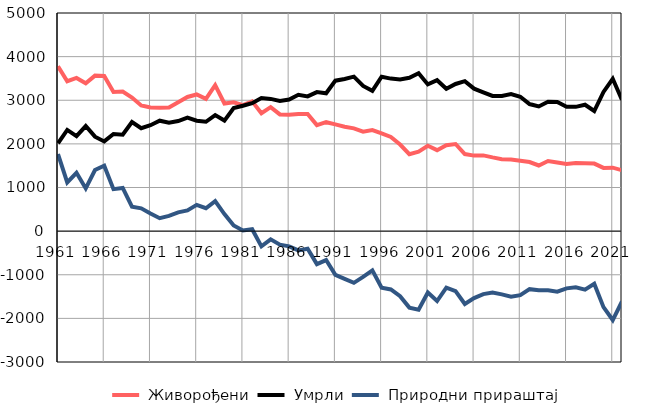
| Category |  Живорођени |  Умрли |  Природни прираштај |
|---|---|---|---|
| 1961.0 | 3780 | 2013 | 1767 |
| 1962.0 | 3436 | 2319 | 1117 |
| 1963.0 | 3512 | 2176 | 1336 |
| 1964.0 | 3388 | 2409 | 979 |
| 1965.0 | 3565 | 2165 | 1400 |
| 1966.0 | 3555 | 2056 | 1499 |
| 1967.0 | 3188 | 2226 | 962 |
| 1968.0 | 3201 | 2211 | 990 |
| 1969.0 | 3062 | 2500 | 562 |
| 1970.0 | 2880 | 2358 | 522 |
| 1971.0 | 2833 | 2428 | 405 |
| 1972.0 | 2828 | 2531 | 297 |
| 1973.0 | 2833 | 2484 | 349 |
| 1974.0 | 2954 | 2524 | 430 |
| 1975.0 | 3075 | 2601 | 474 |
| 1976.0 | 3133 | 2531 | 602 |
| 1977.0 | 3032 | 2507 | 525 |
| 1978.0 | 3346 | 2659 | 687 |
| 1979.0 | 2925 | 2534 | 391 |
| 1980.0 | 2952 | 2823 | 129 |
| 1981.0 | 2890 | 2874 | 16 |
| 1982.0 | 2975 | 2932 | 43 |
| 1983.0 | 2702 | 3051 | -349 |
| 1984.0 | 2842 | 3031 | -189 |
| 1985.0 | 2675 | 2986 | -311 |
| 1986.0 | 2665 | 3015 | -350 |
| 1987.0 | 2684 | 3125 | -441 |
| 1988.0 | 2685 | 3089 | -404 |
| 1989.0 | 2430 | 3187 | -757 |
| 1990.0 | 2497 | 3160 | -663 |
| 1991.0 | 2448 | 3449 | -1001 |
| 1992.0 | 2394 | 3488 | -1094 |
| 1993.0 | 2355 | 3541 | -1186 |
| 1994.0 | 2279 | 3329 | -1050 |
| 1995.0 | 2316 | 3217 | -901 |
| 1996.0 | 2241 | 3539 | -1298 |
| 1997.0 | 2158 | 3496 | -1338 |
| 1998.0 | 1985 | 3477 | -1492 |
| 1999.0 | 1763 | 3516 | -1753 |
| 2000.0 | 1821 | 3621 | -1800 |
| 2001.0 | 1956 | 3363 | -1407 |
| 2002.0 | 1856 | 3459 | -1603 |
| 2003.0 | 1969 | 3263 | -1294 |
| 2004.0 | 1997 | 3373 | -1376 |
| 2005.0 | 1767 | 3438 | -1671 |
| 2006.0 | 1731 | 3266 | -1535 |
| 2007.0 | 1736 | 3180 | -1444 |
| 2008.0 | 1690 | 3098 | -1408 |
| 2009.0 | 1649 | 3099 | -1450 |
| 2010.0 | 1642 | 3144 | -1502 |
| 2011.0 | 1613 | 3081 | -1468 |
| 2012.0 | 1583 | 2913 | -1330 |
| 2013.0 | 1505 | 2858 | -1353 |
| 2014.0 | 1606 | 2964 | -1358 |
| 2015.0 | 1571 | 2960 | -1389 |
| 2016.0 | 1538 | 2850 | -1312 |
| 2017.0 | 1561 | 2849 | -1288 |
| 2018.0 | 1557 | 2897 | -1340 |
| 2019.0 | 1548 | 2753 | -1205 |
| 2020.0 | 1449 | 3191 | -1742 |
| 2021.0 | 1454 | 3492 | -2038 |
| 2022.0 | 1395 | 3008 | -1613 |